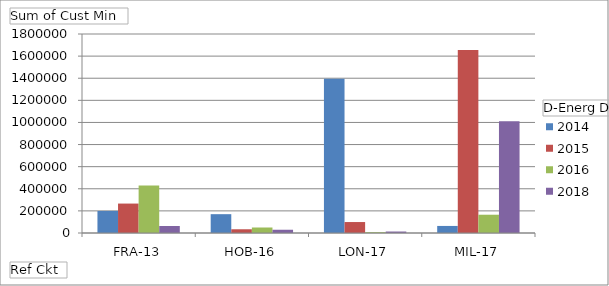
| Category | 2014 | 2015 | 2016 | 2018 |
|---|---|---|---|---|
| FRA-13 | 199552 | 266241 | 430305 | 63352 |
| HOB-16 | 170297 | 33786 | 49783 | 29414 |
| LON-17 | 1395508 | 99160 | 7193 | 13402 |
| MIL-17 | 63819 | 1655582 | 165322 | 1010485 |